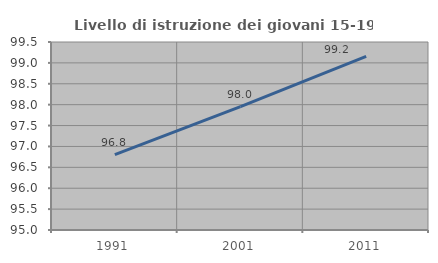
| Category | Livello di istruzione dei giovani 15-19 anni |
|---|---|
| 1991.0 | 96.805 |
| 2001.0 | 97.951 |
| 2011.0 | 99.156 |